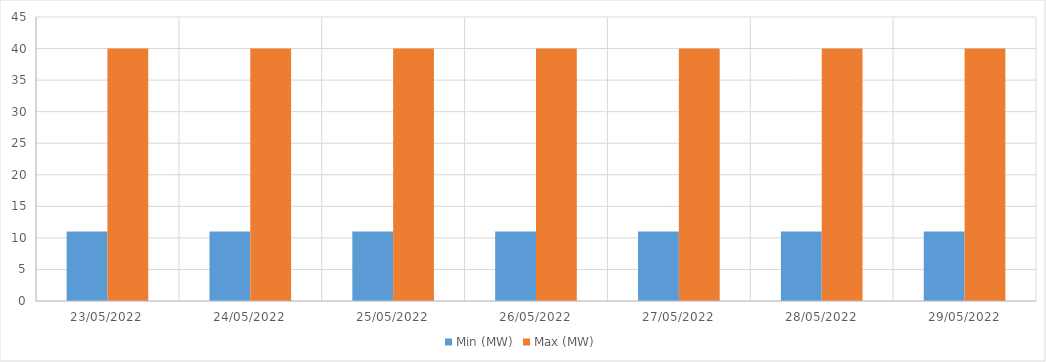
| Category | Min (MW) | Max (MW) |
|---|---|---|
| 23/05/2022 | 11 | 40 |
| 24/05/2022 | 11 | 40 |
| 25/05/2022 | 11 | 40 |
| 26/05/2022 | 11 | 40 |
| 27/05/2022 | 11 | 40 |
| 28/05/2022 | 11 | 40 |
| 29/05/2022 | 11 | 40 |